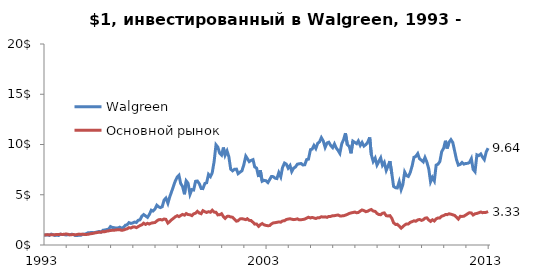
| Category | Walgreen | Основной рынок |
|---|---|---|
| 1993-01-04 | 1 | 1 |
| 1993-02-01 | 0.98 | 1.01 |
| 1993-03-01 | 1.015 | 1.029 |
| 1993-04-01 | 0.955 | 1.003 |
| 1993-05-03 | 1.08 | 1.026 |
| 1993-06-01 | 1.02 | 1.027 |
| 1993-07-01 | 0.95 | 1.021 |
| 1993-08-02 | 0.985 | 1.056 |
| 1993-09-01 | 0.947 | 1.046 |
| 1993-10-01 | 1.078 | 1.066 |
| 1993-11-01 | 1.038 | 1.052 |
| 1993-12-01 | 1.04 | 1.063 |
| 1994-01-03 | 0.995 | 1.098 |
| 1994-02-01 | 1.038 | 1.065 |
| 1994-03-01 | 1.02 | 1.016 |
| 1994-04-04 | 1.068 | 1.028 |
| 1994-05-02 | 1.05 | 1.04 |
| 1994-06-01 | 0.935 | 1.013 |
| 1994-07-01 | 0.94 | 1.044 |
| 1994-08-01 | 0.97 | 1.084 |
| 1994-09-01 | 0.97 | 1.055 |
| 1994-10-03 | 1.068 | 1.077 |
| 1994-11-01 | 1.078 | 1.034 |
| 1994-12-01 | 1.13 | 1.047 |
| 1995-01-03 | 1.231 | 1.072 |
| 1995-02-01 | 1.228 | 1.111 |
| 1995-03-01 | 1.253 | 1.141 |
| 1995-04-03 | 1.223 | 1.173 |
| 1995-05-01 | 1.258 | 1.216 |
| 1995-06-01 | 1.308 | 1.242 |
| 1995-07-03 | 1.351 | 1.281 |
| 1995-08-01 | 1.286 | 1.281 |
| 1995-09-01 | 1.469 | 1.332 |
| 1995-10-02 | 1.494 | 1.325 |
| 1995-11-01 | 1.539 | 1.38 |
| 1995-12-01 | 1.571 | 1.404 |
| 1996-01-02 | 1.837 | 1.45 |
| 1996-02-01 | 1.742 | 1.46 |
| 1996-03-01 | 1.724 | 1.471 |
| 1996-04-01 | 1.689 | 1.491 |
| 1996-05-01 | 1.689 | 1.525 |
| 1996-06-03 | 1.774 | 1.528 |
| 1996-07-01 | 1.682 | 1.458 |
| 1996-08-01 | 1.747 | 1.486 |
| 1996-09-03 | 1.967 | 1.566 |
| 1996-10-01 | 2.008 | 1.607 |
| 1996-11-01 | 2.226 | 1.725 |
| 1996-12-02 | 2.145 | 1.688 |
| 1997-01-02 | 2.193 | 1.792 |
| 1997-02-03 | 2.286 | 1.802 |
| 1997-03-03 | 2.238 | 1.726 |
| 1997-04-01 | 2.459 | 1.826 |
| 1997-05-01 | 2.506 | 1.933 |
| 1997-06-02 | 2.875 | 2.017 |
| 1997-07-01 | 3.028 | 2.175 |
| 1997-08-01 | 2.895 | 2.05 |
| 1997-09-02 | 2.752 | 2.159 |
| 1997-10-01 | 3.02 | 2.084 |
| 1997-11-03 | 3.466 | 2.177 |
| 1997-12-01 | 3.378 | 2.212 |
| 1998-01-02 | 3.566 | 2.234 |
| 1998-02-02 | 3.957 | 2.391 |
| 1998-03-02 | 3.802 | 2.511 |
| 1998-04-01 | 3.722 | 2.534 |
| 1998-05-01 | 3.802 | 2.486 |
| 1998-06-01 | 4.464 | 2.584 |
| 1998-07-01 | 4.667 | 2.554 |
| 1998-08-03 | 4.153 | 2.182 |
| 1998-09-01 | 4.767 | 2.318 |
| 1998-10-01 | 5.268 | 2.504 |
| 1998-11-02 | 5.837 | 2.652 |
| 1998-12-01 | 6.343 | 2.801 |
| 1999-01-04 | 6.769 | 2.916 |
| 1999-02-01 | 6.94 | 2.822 |
| 1999-03-01 | 6.125 | 2.932 |
| 1999-04-01 | 5.827 | 3.043 |
| 1999-05-03 | 5.048 | 2.967 |
| 1999-06-01 | 6.378 | 3.128 |
| 1999-07-01 | 6.148 | 3.028 |
| 1999-08-02 | 5.043 | 3.009 |
| 1999-09-01 | 5.516 | 2.923 |
| 1999-10-01 | 5.476 | 3.106 |
| 1999-11-01 | 6.338 | 3.165 |
| 1999-12-01 | 6.368 | 3.348 |
| 2000-01-03 | 6.083 | 3.178 |
| 2000-02-01 | 5.627 | 3.114 |
| 2000-03-01 | 5.612 | 3.415 |
| 2000-04-03 | 6.13 | 3.31 |
| 2000-05-01 | 6.19 | 3.238 |
| 2000-06-01 | 7.025 | 3.315 |
| 2000-07-03 | 6.807 | 3.261 |
| 2000-08-01 | 7.185 | 3.459 |
| 2000-09-01 | 8.288 | 3.274 |
| 2000-10-02 | 9.967 | 3.258 |
| 2000-11-01 | 9.742 | 2.997 |
| 2000-12-01 | 9.14 | 3.009 |
| 2001-01-02 | 8.95 | 3.113 |
| 2001-02-01 | 9.699 | 2.826 |
| 2001-03-01 | 8.927 | 2.644 |
| 2001-04-02 | 9.361 | 2.848 |
| 2001-05-01 | 8.802 | 2.862 |
| 2001-06-01 | 7.546 | 2.79 |
| 2001-07-02 | 7.381 | 2.76 |
| 2001-08-01 | 7.531 | 2.583 |
| 2001-09-04 | 7.549 | 2.372 |
| 2001-10-01 | 7.098 | 2.415 |
| 2001-11-01 | 7.243 | 2.597 |
| 2001-12-03 | 7.386 | 2.617 |
| 2002-01-02 | 7.962 | 2.576 |
| 2002-02-04 | 8.84 | 2.522 |
| 2002-03-01 | 8.609 | 2.615 |
| 2002-04-01 | 8.296 | 2.454 |
| 2002-05-01 | 8.414 | 2.432 |
| 2002-06-03 | 8.494 | 2.256 |
| 2002-07-01 | 7.769 | 2.078 |
| 2002-08-01 | 7.649 | 2.088 |
| 2002-09-03 | 6.769 | 1.858 |
| 2002-10-01 | 7.429 | 2.019 |
| 2002-11-01 | 6.343 | 2.134 |
| 2002-12-02 | 6.431 | 2.005 |
| 2003-01-02 | 6.391 | 1.95 |
| 2003-02-03 | 6.211 | 1.917 |
| 2003-03-03 | 6.504 | 1.933 |
| 2003-04-01 | 6.81 | 2.09 |
| 2003-05-01 | 6.802 | 2.196 |
| 2003-06-02 | 6.649 | 2.221 |
| 2003-07-01 | 6.609 | 2.257 |
| 2003-08-01 | 7.206 | 2.297 |
| 2003-09-02 | 6.779 | 2.27 |
| 2003-10-01 | 7.704 | 2.395 |
| 2003-11-03 | 8.153 | 2.412 |
| 2003-12-01 | 8.058 | 2.534 |
| 2004-01-02 | 7.652 | 2.578 |
| 2004-02-02 | 7.907 | 2.609 |
| 2004-03-01 | 7.308 | 2.567 |
| 2004-04-01 | 7.647 | 2.524 |
| 2004-05-03 | 7.774 | 2.554 |
| 2004-06-01 | 8.04 | 2.6 |
| 2004-07-01 | 8.083 | 2.511 |
| 2004-08-02 | 8.105 | 2.517 |
| 2004-09-01 | 7.967 | 2.54 |
| 2004-10-01 | 7.98 | 2.576 |
| 2004-11-01 | 8.501 | 2.675 |
| 2004-12-01 | 8.544 | 2.762 |
| 2005-01-03 | 9.489 | 2.692 |
| 2005-02-01 | 9.549 | 2.743 |
| 2005-03-01 | 9.905 | 2.691 |
| 2005-04-01 | 9.602 | 2.637 |
| 2005-05-02 | 10.12 | 2.715 |
| 2005-06-01 | 10.266 | 2.715 |
| 2005-07-01 | 10.682 | 2.813 |
| 2005-08-01 | 10.356 | 2.781 |
| 2005-09-01 | 9.712 | 2.801 |
| 2005-10-03 | 10.155 | 2.751 |
| 2005-11-01 | 10.226 | 2.848 |
| 2005-12-01 | 9.907 | 2.845 |
| 2006-01-03 | 9.687 | 2.917 |
| 2006-02-01 | 10.055 | 2.919 |
| 2006-03-01 | 9.669 | 2.951 |
| 2006-04-03 | 9.398 | 2.987 |
| 2006-05-01 | 9.115 | 2.895 |
| 2006-06-01 | 10.068 | 2.895 |
| 2006-07-03 | 10.504 | 2.91 |
| 2006-08-01 | 11.123 | 2.971 |
| 2006-09-01 | 9.982 | 3.044 |
| 2006-10-02 | 9.822 | 3.14 |
| 2006-11-01 | 9.123 | 3.192 |
| 2006-12-01 | 10.338 | 3.232 |
| 2007-01-03 | 10.206 | 3.278 |
| 2007-02-01 | 10.088 | 3.206 |
| 2007-03-01 | 10.356 | 3.238 |
| 2007-04-02 | 9.907 | 3.378 |
| 2007-05-01 | 10.203 | 3.488 |
| 2007-06-01 | 9.842 | 3.426 |
| 2007-07-02 | 9.987 | 3.317 |
| 2007-08-01 | 10.211 | 3.359 |
| 2007-09-04 | 10.702 | 3.48 |
| 2007-10-01 | 8.982 | 3.531 |
| 2007-11-01 | 8.311 | 3.376 |
| 2007-12-03 | 8.649 | 3.346 |
| 2008-01-02 | 7.957 | 3.142 |
| 2008-02-01 | 8.313 | 3.033 |
| 2008-03-03 | 8.674 | 3.014 |
| 2008-04-01 | 7.935 | 3.158 |
| 2008-05-01 | 8.223 | 3.192 |
| 2008-06-02 | 7.421 | 2.917 |
| 2008-07-01 | 7.84 | 2.888 |
| 2008-08-01 | 8.343 | 2.924 |
| 2008-09-02 | 7.09 | 2.658 |
| 2008-10-01 | 5.83 | 2.208 |
| 2008-11-03 | 5.694 | 2.043 |
| 2008-12-01 | 5.677 | 2.059 |
| 2009-01-02 | 6.308 | 1.882 |
| 2009-02-02 | 5.514 | 1.675 |
| 2009-03-02 | 6 | 1.818 |
| 2009-04-01 | 7.263 | 1.989 |
| 2009-05-01 | 6.91 | 2.095 |
| 2009-06-01 | 6.82 | 2.095 |
| 2009-07-01 | 7.203 | 2.251 |
| 2009-08-03 | 7.895 | 2.326 |
| 2009-09-01 | 8.729 | 2.409 |
| 2009-10-01 | 8.815 | 2.362 |
| 2009-11-02 | 9.093 | 2.497 |
| 2009-12-01 | 8.586 | 2.541 |
| 2010-01-04 | 8.429 | 2.447 |
| 2010-02-01 | 8.273 | 2.517 |
| 2010-03-01 | 8.709 | 2.665 |
| 2010-04-01 | 8.253 | 2.705 |
| 2010-05-03 | 7.551 | 2.483 |
| 2010-06-01 | 6.293 | 2.349 |
| 2010-07-01 | 6.729 | 2.511 |
| 2010-08-02 | 6.376 | 2.391 |
| 2010-09-01 | 7.945 | 2.601 |
| 2010-10-01 | 8.035 | 2.697 |
| 2010-11-01 | 8.306 | 2.691 |
| 2010-12-01 | 9.286 | 2.866 |
| 2011-01-03 | 9.639 | 2.931 |
| 2011-02-01 | 10.373 | 3.025 |
| 2011-03-01 | 9.607 | 3.022 |
| 2011-04-01 | 10.226 | 3.108 |
| 2011-05-02 | 10.484 | 3.066 |
| 2011-06-01 | 10.203 | 3.01 |
| 2011-07-01 | 9.381 | 2.945 |
| 2011-08-01 | 8.511 | 2.778 |
| 2011-09-01 | 7.95 | 2.579 |
| 2011-10-03 | 8.025 | 2.856 |
| 2011-11-01 | 8.208 | 2.842 |
| 2011-12-01 | 8.048 | 2.866 |
| 2012-01-03 | 8.12 | 2.991 |
| 2012-02-01 | 8.123 | 3.112 |
| 2012-03-01 | 8.206 | 3.21 |
| 2012-04-02 | 8.589 | 3.186 |
| 2012-05-01 | 7.529 | 2.986 |
| 2012-06-01 | 7.296 | 3.104 |
| 2012-07-02 | 8.97 | 3.144 |
| 2012-08-01 | 8.89 | 3.206 |
| 2012-09-04 | 9.058 | 3.283 |
| 2012-10-01 | 8.757 | 3.218 |
| 2012-11-01 | 8.499 | 3.228 |
| 2012-12-03 | 9.276 | 3.25 |
| 2013-01-02 | 9.637 | 3.33 |